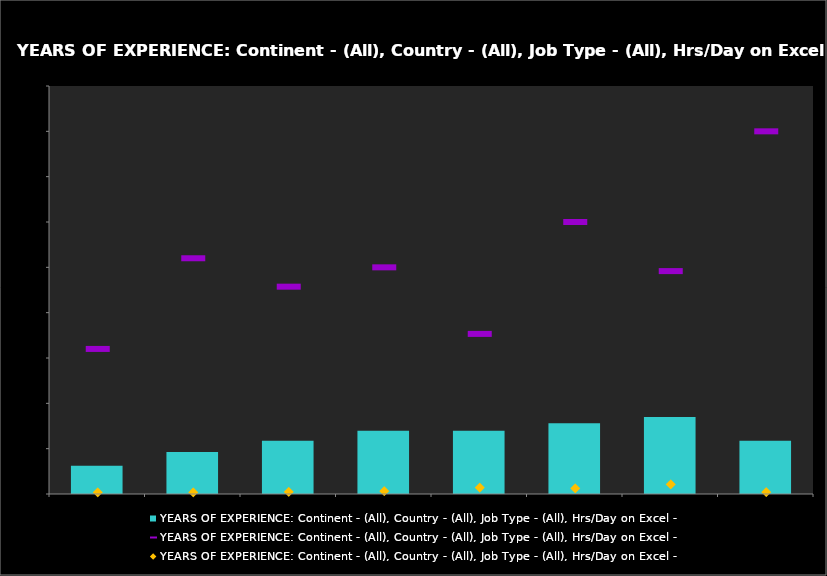
| Category | Average of Salary in USD |
|---|---|
| 1) Btw 0 - 5 Yrs | 31125.981 |
| 2) Btw 6 - 10 Yrs | 46380.3 |
| 3) Btw 11 - 15 Yrs | 58827.032 |
| 4) Btw 16 - 20 Yrs | 69869.202 |
| 5) Btw 21 - 25 Yrs | 69668.442 |
| 6) Btw 26 - 30 Yrs | 77961.32 |
| 7) Btw 31 - 40 Yrs | 84850.823 |
| 8) Unknown | 58737.646 |